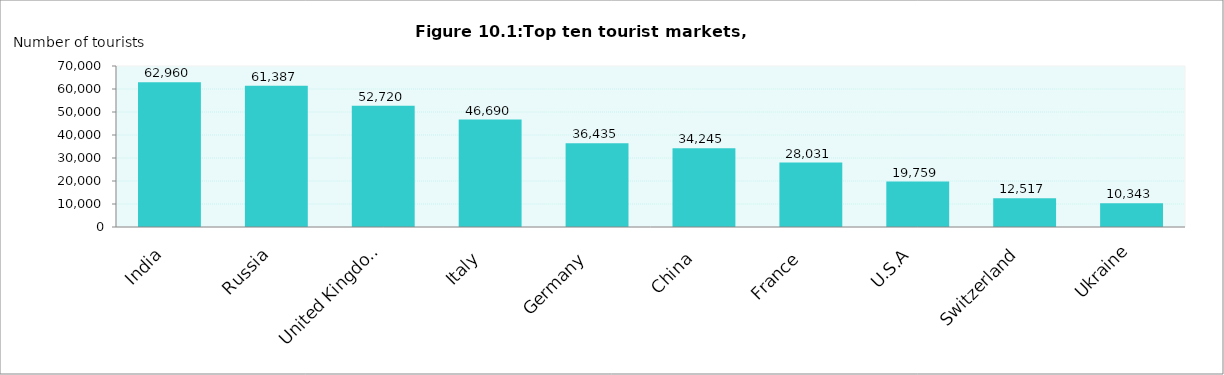
| Category | Series 0 |
|---|---|
|    India | 62960 |
|    Russia | 61387 |
|    United Kingdom | 52720 |
|    Italy | 46690 |
|    Germany | 36435 |
|    China | 34245 |
|    France | 28031 |
|    U.S.A | 19759 |
|    Switzerland | 12517 |
|    Ukraine | 10343 |